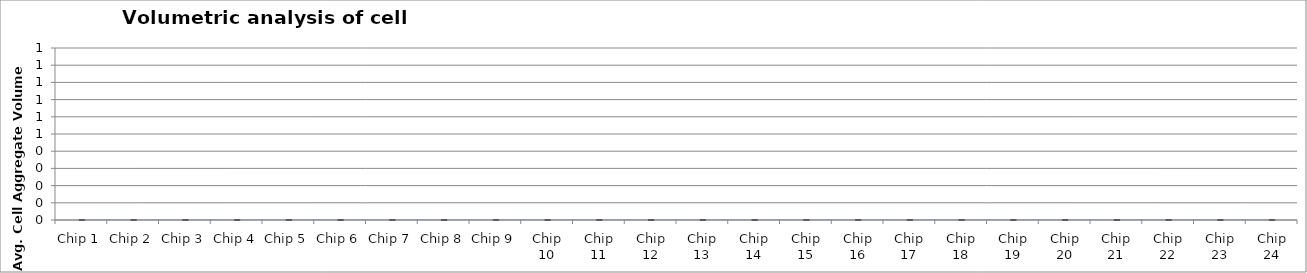
| Category | Volume |
|---|---|
| Chip 1 | 0 |
| Chip 2 | 0 |
| Chip 3 | 0 |
| Chip 4 | 0 |
| Chip 5 | 0 |
| Chip 6 | 0 |
| Chip 7 | 0 |
| Chip 8 | 0 |
| Chip 9 | 0 |
| Chip 10 | 0 |
| Chip 11 | 0 |
| Chip 12 | 0 |
| Chip 13 | 0 |
| Chip 14 | 0 |
| Chip 15 | 0 |
| Chip 16 | 0 |
| Chip 17 | 0 |
| Chip 18 | 0 |
| Chip 19 | 0 |
| Chip 20 | 0 |
| Chip 21 | 0 |
| Chip 22 | 0 |
| Chip 23 | 0 |
| Chip 24 | 0 |